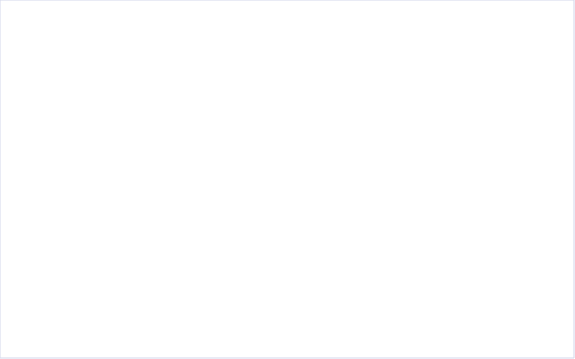
| Category | Overall (avg.) | Price & Cost (avg.) | Quality (avg.) | Service, Delivery & Quantity (avg.) | Communication (avg.) | Compliance (avg.) | Sustainability (avg.) | Payment terms (avg.) | Certifications (avg.) | Value additions (avg.) | Innovation (avg.) | Financial health (avg.) |
|---|---|---|---|---|---|---|---|---|---|---|---|---|
| Total | 3.125 | 2.75 | 2.625 | 2.875 | 2.875 | 2.417 |  |  |  |  |  |  |